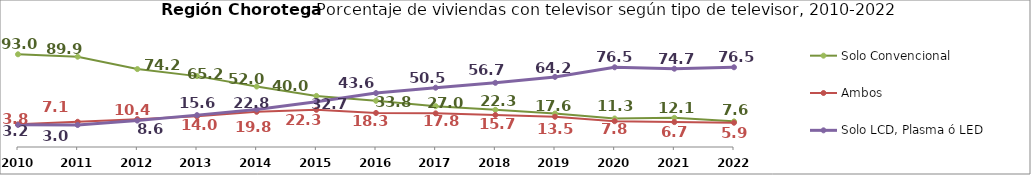
| Category | Solo Convencional | Ambos | Solo LCD, Plasma ó LED |
|---|---|---|---|
| 2010.0 | 92.995 | 3.827 | 3.178 |
| 2011.0 | 89.925 | 7.095 | 2.98 |
| 2012.0 | 74.154 | 10.44 | 8.588 |
| 2013.0 | 65.205 | 13.991 | 15.569 |
| 2014.0 | 51.984 | 19.793 | 22.833 |
| 2015.0 | 40.019 | 22.329 | 32.673 |
| 2016.0 | 33.811 | 18.317 | 43.614 |
| 2017.0 | 26.96 | 17.806 | 50.467 |
| 2018.0 | 22.3 | 15.715 | 56.698 |
| 2019.0 | 17.575 | 13.525 | 64.23 |
| 2020.0 | 11.287 | 7.795 | 76.467 |
| 2021.0 | 12.134 | 6.685 | 74.65 |
| 2022.0 | 7.566 | 5.908 | 76.481 |